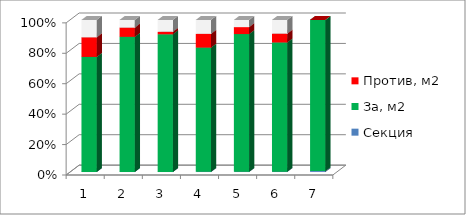
| Category | Секция | За, м2 | Против, м2 | Возд., м2 |
|---|---|---|---|---|
| 0 | 1 | 2663.769 | 454.31 | 401.933 |
| 1 | 2 | 3036.28 | 207.6 | 172.6 |
| 2 | 3 | 3372.119 | 61.25 | 291.3 |
| 3 | 4 | 2536.58 | 280.75 | 284.55 |
| 4 | 5 | 3263.4 | 165.3 | 170.3 |
| 5 | 6 | 2012.25 | 136.9 | 214.2 |
| 6 | 7 | 1110.4 | 0 | 0 |